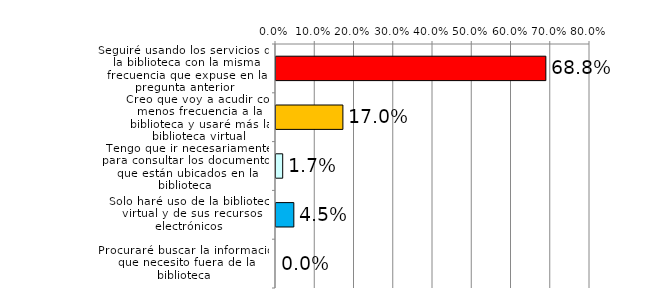
| Category | Series 1 |
|---|---|
| Seguiré usando los servicios de la biblioteca con la misma frecuencia que expuse en la pregunta anterior | 0.688 |
| Creo que voy a acudir con menos frecuencia a la biblioteca y usaré más la biblioteca virtual | 0.17 |
| Tengo que ir necesariamente para consultar los documentos que están ubicados en la biblioteca | 0.017 |
| Solo haré uso de la biblioteca virtual y de sus recursos electrónicos | 0.045 |
| Procuraré buscar la información que necesito fuera de la biblioteca | 0 |